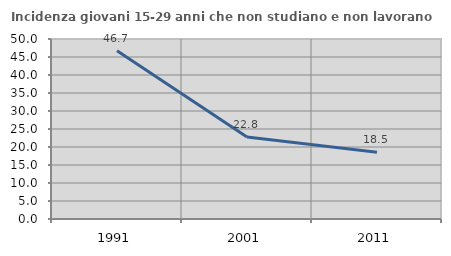
| Category | Incidenza giovani 15-29 anni che non studiano e non lavorano  |
|---|---|
| 1991.0 | 46.711 |
| 2001.0 | 22.759 |
| 2011.0 | 18.53 |